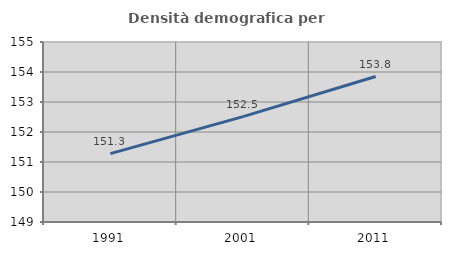
| Category | Densità demografica |
|---|---|
| 1991.0 | 151.28 |
| 2001.0 | 152.513 |
| 2011.0 | 153.849 |